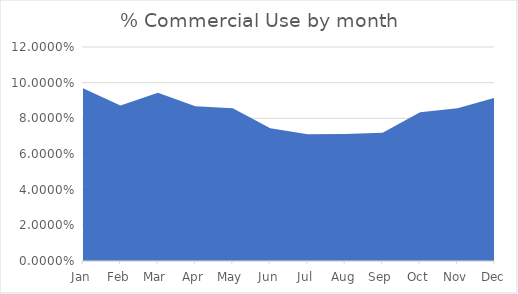
| Category | Series 0 |
|---|---|
| Jan | 0.097 |
| Feb | 0.087 |
| Mar | 0.094 |
| Apr | 0.087 |
| May | 0.086 |
| Jun | 0.074 |
| Jul | 0.071 |
| Aug | 0.071 |
| Sep | 0.072 |
| Oct | 0.083 |
| Nov | 0.086 |
| Dec | 0.092 |